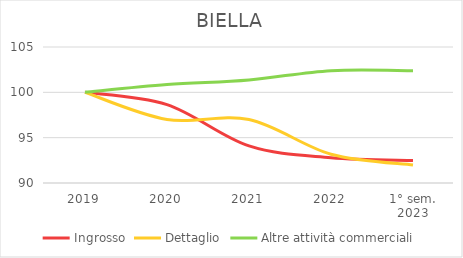
| Category | Ingrosso | Dettaglio | Altre attività commerciali |
|---|---|---|---|
| 2019 | 100 | 100 | 100 |
| 2020 | 98.645 | 97.001 | 100.855 |
| 2021 | 94.089 | 97.001 | 101.368 |
| 2022 | 92.796 | 93.173 | 102.393 |
| 1° sem.
2023 | 92.488 | 91.989 | 102.393 |